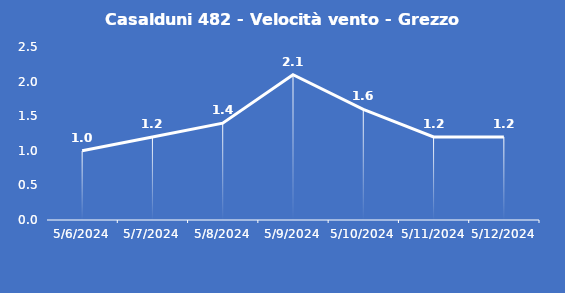
| Category | Casalduni 482 - Velocità vento - Grezzo (m/s) |
|---|---|
| 5/6/24 | 1 |
| 5/7/24 | 1.2 |
| 5/8/24 | 1.4 |
| 5/9/24 | 2.1 |
| 5/10/24 | 1.6 |
| 5/11/24 | 1.2 |
| 5/12/24 | 1.2 |